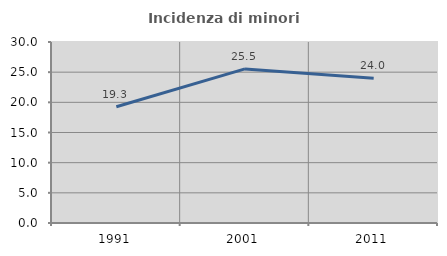
| Category | Incidenza di minori stranieri |
|---|---|
| 1991.0 | 19.277 |
| 2001.0 | 25.541 |
| 2011.0 | 23.996 |